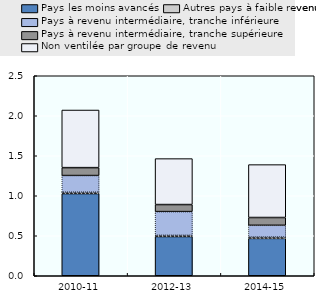
| Category | Pays les moins avancés | Autres pays à faible revenu | Pays à revenu intermédiaire, tranche inférieure | Pays à revenu intermédiaire, tranche supérieure | Non ventilée par groupe de revenu |
|---|---|---|---|---|---|
| 0 | 1027.485 | 16.395 | 208.84 | 98.77 | 720.225 |
| 1 | 490.455 | 14.745 | 296.385 | 88.3 | 574.48 |
| 2 | 467.087 | 16.686 | 146.796 | 97.555 | 661.161 |